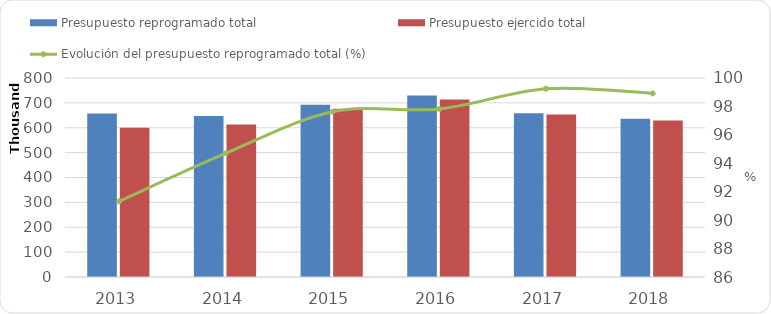
| Category | Presupuesto reprogramado total | Presupuesto ejercido total |
|---|---|---|
| 2013 | 657148.1 | 600163.1 |
| 2014 | 647302.9 | 613052.1 |
| 2015 | 692840.462 | 676403.338 |
| 2016 | 729594.261 | 713725.8 |
| 2017 | 658646.191 | 653670.792 |
| 2018 | 635684.884 | 628799.563 |